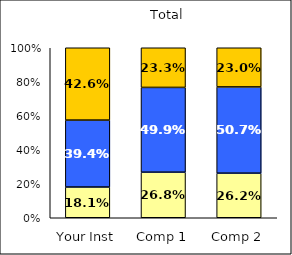
| Category | Low Leadership | Average Leadership | High Leadership |
|---|---|---|---|
| Your Inst | 0.181 | 0.394 | 0.426 |
| Comp 1 | 0.268 | 0.499 | 0.233 |
| Comp 2 | 0.262 | 0.507 | 0.23 |